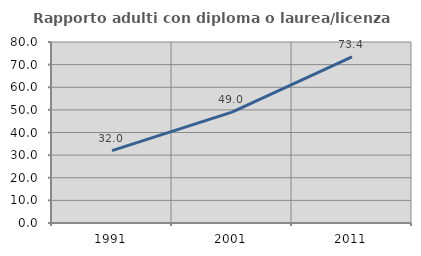
| Category | Rapporto adulti con diploma o laurea/licenza media  |
|---|---|
| 1991.0 | 31.959 |
| 2001.0 | 49.009 |
| 2011.0 | 73.419 |